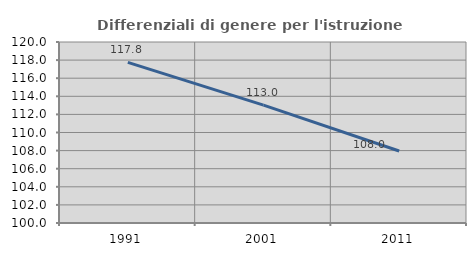
| Category | Differenziali di genere per l'istruzione superiore |
|---|---|
| 1991.0 | 117.754 |
| 2001.0 | 113.019 |
| 2011.0 | 107.952 |